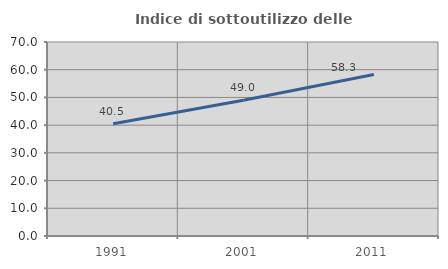
| Category | Indice di sottoutilizzo delle abitazioni  |
|---|---|
| 1991.0 | 40.476 |
| 2001.0 | 49.007 |
| 2011.0 | 58.278 |